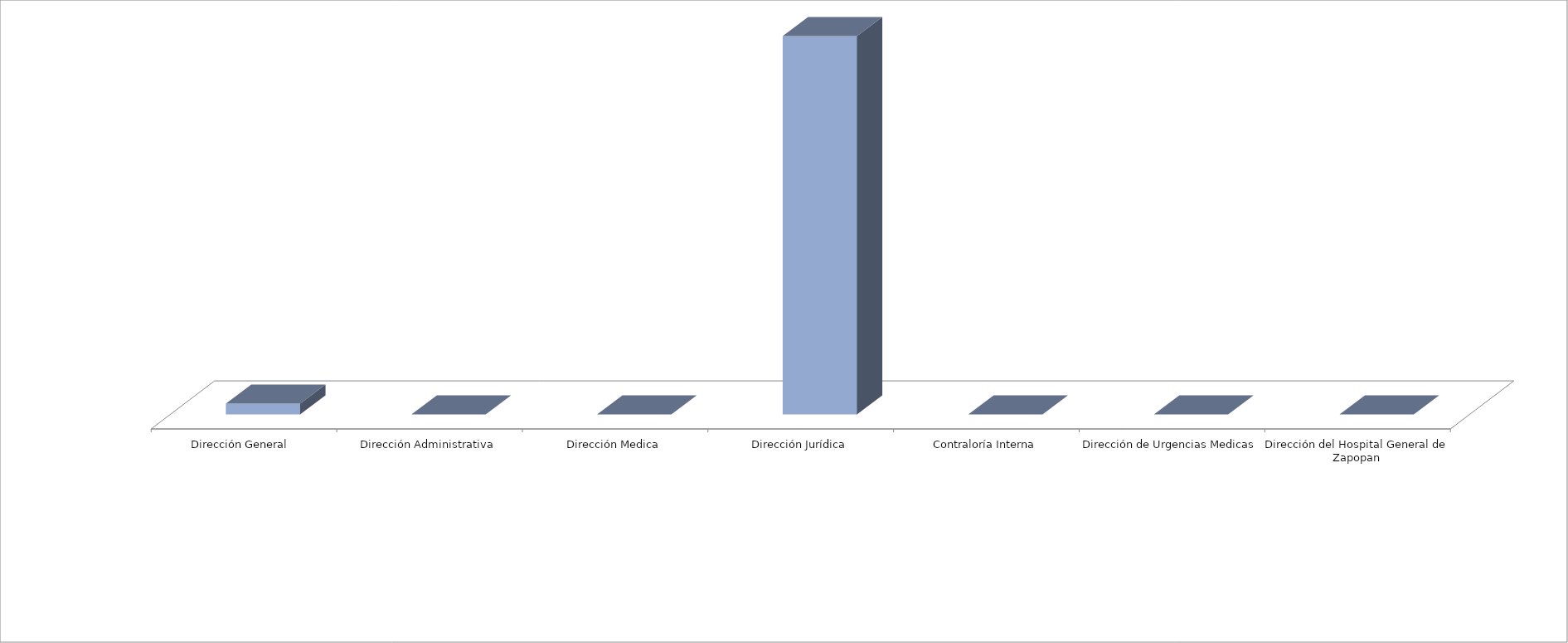
| Category | Series 0 | Series 1 |
|---|---|---|
| Dirección General  |  | 1 |
| Dirección Administrativa |  | 0 |
| Dirección Medica |  | 0 |
| Dirección Jurídica |  | 35 |
| Contraloría Interna |  | 0 |
| Dirección de Urgencias Medicas |  | 0 |
| Dirección del Hospital General de Zapopan |  | 0 |